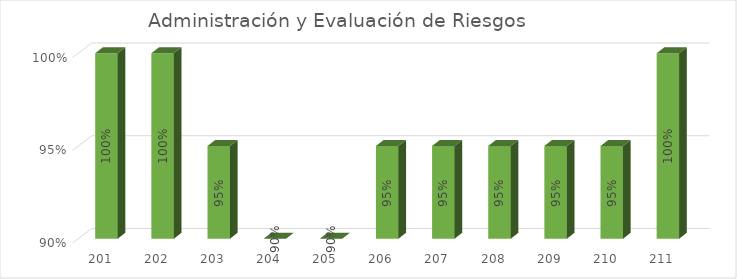
| Category | % Avance |
|---|---|
| 201.0 | 1 |
| 202.0 | 1 |
| 203.0 | 0.95 |
| 204.0 | 0.9 |
| 205.0 | 0.9 |
| 206.0 | 0.95 |
| 207.0 | 0.95 |
| 208.0 | 0.95 |
| 209.0 | 0.95 |
| 210.0 | 0.95 |
| 211.0 | 1 |